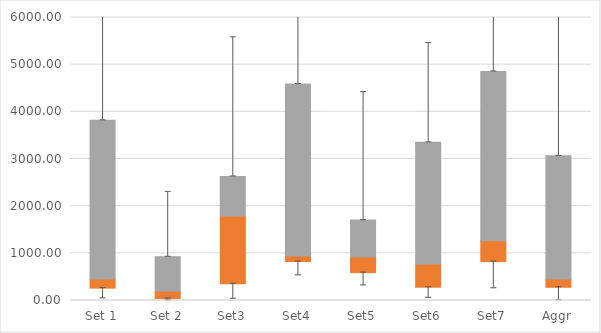
| Category | Q1 | Median-Q1 | Q3-Median |
|---|---|---|---|
| Set 1 | 262.42 | 191.104 | 3366.661 |
| Set 2 | 42.812 | 155.188 | 730.897 |
| Set3 | 356.171 | 1433.594 | 841.4 |
| Set4 | 826.728 | 118.847 | 3644.275 |
| Set5 | 590.971 | 329.349 | 784.798 |
| Set6 | 281.571 | 492.285 | 2579.263 |
| Set7 | 824.531 | 443.475 | 3589.411 |
| Aggr | 280.866 | 172.657 | 2613.06 |